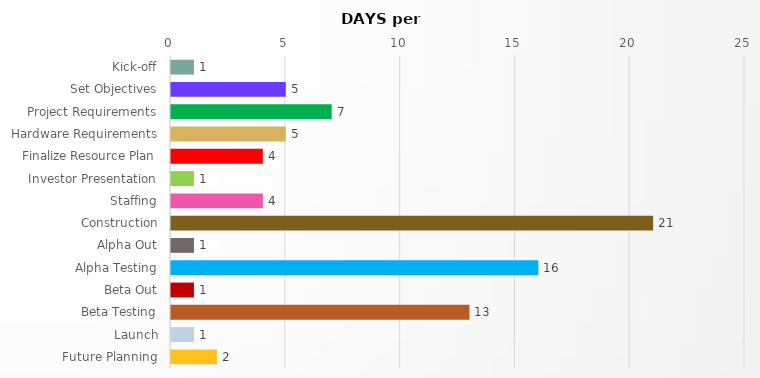
| Category | # of DAYS |
|---|---|
| Kick-off | 1 |
| Set Objectives | 5 |
| Project Requirements | 7 |
| Hardware Requirements | 5 |
| Finalize Resource Plan | 4 |
| Investor Presentation | 1 |
| Staffing | 4 |
| Construction | 21 |
| Alpha Out | 1 |
| Alpha Testing | 16 |
| Beta Out | 1 |
| Beta Testing | 13 |
| Launch | 1 |
| Future Planning | 2 |